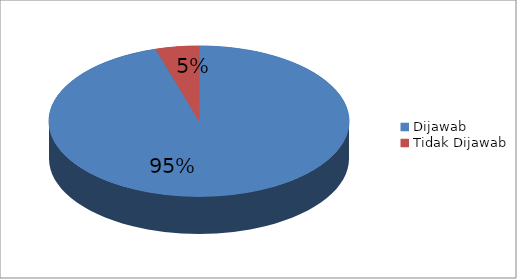
| Category | Series 0 |
|---|---|
| Dijawab | 204 |
| Tidak Dijawab | 10 |